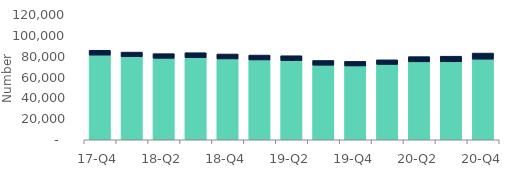
| Category | Homeowners | Buy-to-let |
|---|---|---|
| 17-Q4 | 81290 | 4670 |
| 18-Q1 | 79670 | 4500 |
| 18-Q2 | 78240 | 4440 |
| 18-Q3 | 78820 | 4770 |
| 18-Q4 | 77620 | 4720 |
| 19-Q1 | 76640 | 4680 |
| 19-Q2 | 75960 | 4720 |
| 19-Q3 | 71590 | 4550 |
| 19-Q4 | 70870 | 4390 |
| 20-Q1 | 72350 | 4420 |
| 20-Q2 | 74830 | 5010 |
| 20-Q3 | 74850 | 5400 |
| 20-Q4 | 77410 | 5840 |